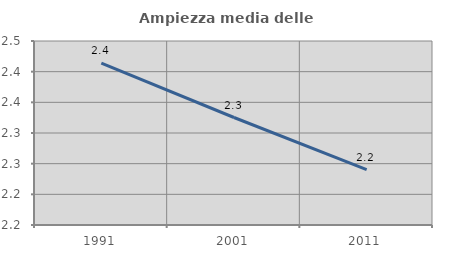
| Category | Ampiezza media delle famiglie |
|---|---|
| 1991.0 | 2.414 |
| 2001.0 | 2.325 |
| 2011.0 | 2.24 |